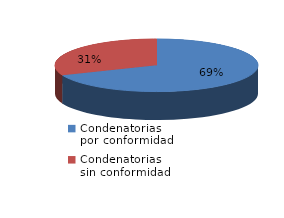
| Category | Series 0 |
|---|---|
| 0 | 1348 |
| 1 | 611 |